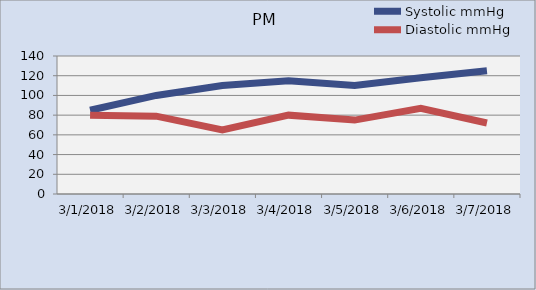
| Category | Systolic mmHg | Diastolic mmHg |
|---|---|---|
| 01/03/2018 | 85 | 80 |
| 02/03/2018 | 100 | 79 |
| 03/03/2018 | 110 | 65 |
| 04/03/2018 | 115 | 80 |
| 05/03/2018 | 110 | 75 |
| 06/03/2018 | 118 | 87 |
| 07/03/2018 | 125 | 72 |